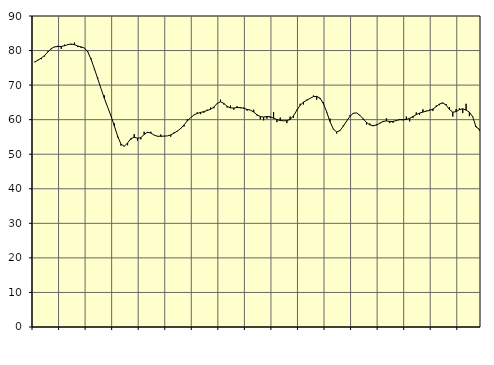
| Category | Piggar | Series 1 |
|---|---|---|
| nan | 76.8 | 76.65 |
| 87.0 | 77.3 | 77.22 |
| 87.0 | 77.5 | 77.82 |
| 87.0 | 78.3 | 78.58 |
| nan | 79.8 | 79.6 |
| 88.0 | 80.4 | 80.57 |
| 88.0 | 81 | 81.07 |
| 88.0 | 81.4 | 81.16 |
| nan | 80.5 | 81.2 |
| 89.0 | 81.7 | 81.38 |
| 89.0 | 81.8 | 81.72 |
| 89.0 | 81.7 | 81.9 |
| nan | 82.3 | 81.71 |
| 90.0 | 81 | 81.32 |
| 90.0 | 80.8 | 81.05 |
| 90.0 | 80.7 | 80.75 |
| nan | 79.9 | 79.63 |
| 91.0 | 77.8 | 77.47 |
| 91.0 | 74.5 | 74.74 |
| 91.0 | 72.2 | 71.86 |
| nan | 69 | 68.99 |
| 92.0 | 67 | 66.18 |
| 92.0 | 63.6 | 63.6 |
| 92.0 | 61 | 61.09 |
| nan | 58.9 | 58.22 |
| 93.0 | 54.9 | 55.22 |
| 93.0 | 52.5 | 52.93 |
| 93.0 | 52.4 | 52.29 |
| nan | 52.6 | 53.26 |
| 94.0 | 54.2 | 54.53 |
| 94.0 | 55.8 | 54.9 |
| 94.0 | 53.9 | 54.63 |
| nan | 54.3 | 54.81 |
| 95.0 | 56.5 | 55.71 |
| 95.0 | 56.2 | 56.37 |
| 95.0 | 56.5 | 56.13 |
| nan | 55.5 | 55.53 |
| 96.0 | 55.1 | 55.21 |
| 96.0 | 55.7 | 55.19 |
| 96.0 | 55.3 | 55.24 |
| nan | 55.3 | 55.3 |
| 97.0 | 55.1 | 55.58 |
| 97.0 | 56.3 | 56.11 |
| 97.0 | 56.6 | 56.7 |
| nan | 57.3 | 57.43 |
| 98.0 | 58 | 58.48 |
| 98.0 | 60.1 | 59.63 |
| 98.0 | 60.6 | 60.6 |
| nan | 61.4 | 61.37 |
| 99.0 | 62.1 | 61.81 |
| 99.0 | 61.6 | 62.09 |
| 99.0 | 62 | 62.34 |
| nan | 62.9 | 62.66 |
| 0.0 | 63.5 | 63 |
| 0.0 | 63.3 | 63.66 |
| 0.0 | 64.6 | 64.71 |
| nan | 65.8 | 65.19 |
| 1.0 | 64.4 | 64.7 |
| 1.0 | 63.5 | 63.85 |
| 1.0 | 64.1 | 63.4 |
| nan | 62.9 | 63.37 |
| 2.0 | 63.9 | 63.49 |
| 2.0 | 63.3 | 63.52 |
| 2.0 | 63.5 | 63.27 |
| nan | 62.6 | 62.98 |
| 3.0 | 62.7 | 62.77 |
| 3.0 | 62.9 | 62.21 |
| 3.0 | 61.2 | 61.42 |
| nan | 60.1 | 60.89 |
| 4.0 | 59.8 | 60.76 |
| 4.0 | 60.3 | 60.92 |
| 4.0 | 60.5 | 60.83 |
| nan | 62.2 | 60.43 |
| 5.0 | 59.3 | 60.04 |
| 5.0 | 60.6 | 59.75 |
| 5.0 | 59.7 | 59.67 |
| nan | 59 | 59.72 |
| 6.0 | 60.9 | 60.07 |
| 6.0 | 60.5 | 61.14 |
| 6.0 | 62.9 | 62.7 |
| nan | 64.6 | 64.15 |
| 7.0 | 64.4 | 65.08 |
| 7.0 | 65.8 | 65.6 |
| 7.0 | 66.2 | 66.18 |
| nan | 67 | 66.65 |
| 8.0 | 65.8 | 66.74 |
| 8.0 | 66 | 66.24 |
| 8.0 | 65.1 | 64.67 |
| nan | 62.1 | 62.24 |
| 9.0 | 60.3 | 59.42 |
| 9.0 | 57.2 | 57.29 |
| 9.0 | 56 | 56.44 |
| nan | 56.7 | 56.85 |
| 10.0 | 58.4 | 58.1 |
| 10.0 | 59.5 | 59.6 |
| 10.0 | 61.3 | 60.95 |
| nan | 61.7 | 61.85 |
| 11.0 | 62 | 61.95 |
| 11.0 | 61.4 | 61.28 |
| 11.0 | 59.9 | 60.24 |
| nan | 58.6 | 59.19 |
| 12.0 | 58.9 | 58.49 |
| 12.0 | 58.1 | 58.28 |
| 12.0 | 58.7 | 58.44 |
| nan | 59.1 | 58.95 |
| 13.0 | 59.3 | 59.51 |
| 13.0 | 60.4 | 59.64 |
| 13.0 | 59 | 59.47 |
| nan | 59.1 | 59.49 |
| 14.0 | 59.6 | 59.76 |
| 14.0 | 60.2 | 59.99 |
| 14.0 | 59.8 | 60 |
| nan | 60.9 | 60.05 |
| 15.0 | 59.5 | 60.38 |
| 15.0 | 60.5 | 60.9 |
| 15.0 | 62.1 | 61.46 |
| nan | 61.4 | 61.9 |
| 16.0 | 63 | 62.2 |
| 16.0 | 62.6 | 62.47 |
| 16.0 | 62.9 | 62.67 |
| nan | 62.5 | 63.08 |
| 17.0 | 64.1 | 63.77 |
| 17.0 | 64.2 | 64.53 |
| 17.0 | 64.7 | 64.87 |
| nan | 64.5 | 64.2 |
| 18.0 | 63.6 | 62.94 |
| 18.0 | 60.9 | 62.17 |
| 18.0 | 63.1 | 62.31 |
| nan | 63.3 | 62.91 |
| 19.0 | 61.9 | 63.15 |
| 19.0 | 64.6 | 62.78 |
| 19.0 | 61 | 62.17 |
| nan | 61 | 60.85 |
| 20.0 | 58.1 | 57.88 |
| 20.0 | 56.8 | 57.26 |